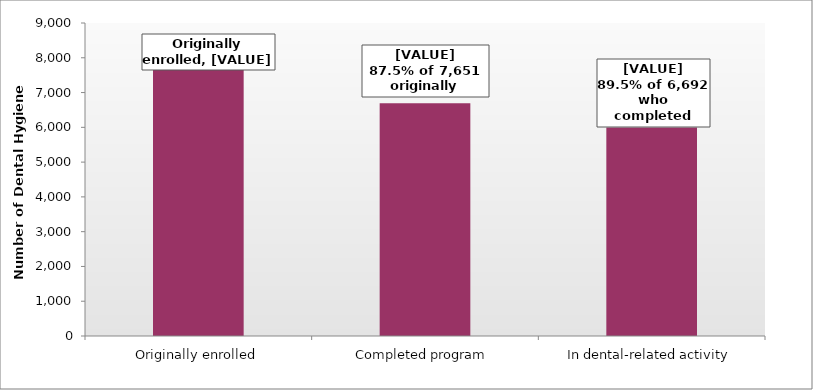
| Category | Series 0 |
|---|---|
| Originally enrolled | 7651 |
| Completed program | 6692 |
| In dental-related activity | 5992 |